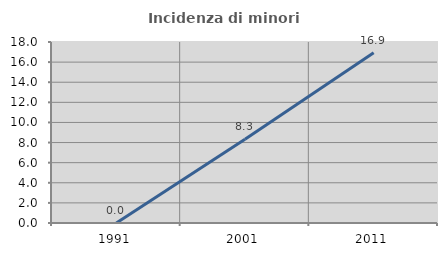
| Category | Incidenza di minori stranieri |
|---|---|
| 1991.0 | 0 |
| 2001.0 | 8.333 |
| 2011.0 | 16.923 |